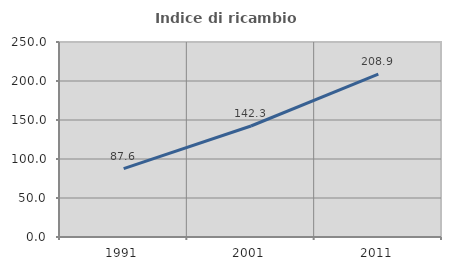
| Category | Indice di ricambio occupazionale  |
|---|---|
| 1991.0 | 87.612 |
| 2001.0 | 142.292 |
| 2011.0 | 208.929 |